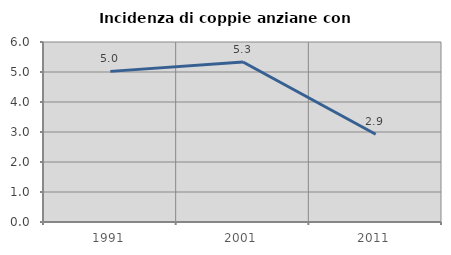
| Category | Incidenza di coppie anziane con figli |
|---|---|
| 1991.0 | 5.021 |
| 2001.0 | 5.333 |
| 2011.0 | 2.927 |